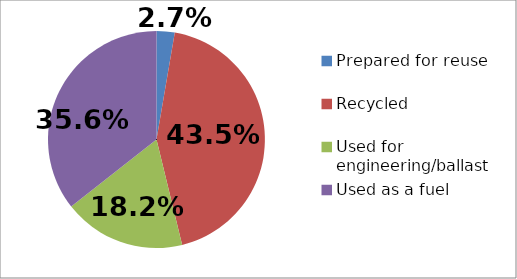
| Category | Series 0 |
|---|---|
| Prepared for reuse | 0.027 |
| Recycled | 0.435 |
| Used for engineering/ballast | 0.182 |
| Used as a fuel | 0.356 |